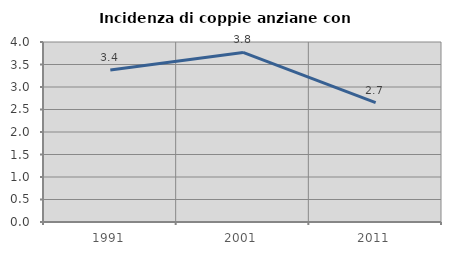
| Category | Incidenza di coppie anziane con figli |
|---|---|
| 1991.0 | 3.378 |
| 2001.0 | 3.768 |
| 2011.0 | 2.653 |